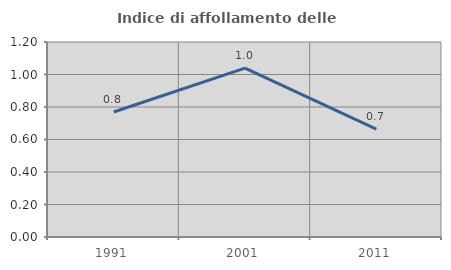
| Category | Indice di affollamento delle abitazioni  |
|---|---|
| 1991.0 | 0.769 |
| 2001.0 | 1.039 |
| 2011.0 | 0.664 |